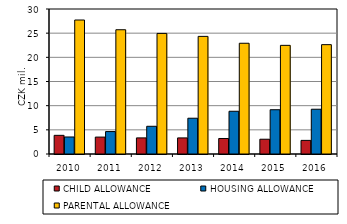
| Category | CHILD ALLOWANCE | HOUSING ALLOWANCE | PARENTAL ALLOWANCE |
|---|---|---|---|
| 2010.0 | 3.862 | 3.521 | 27.722 |
| 2011.0 | 3.498 | 4.641 | 25.709 |
| 2012.0 | 3.332 | 5.732 | 24.95 |
| 2013.0 | 3.329 | 7.403 | 24.336 |
| 2014.0 | 3.207 | 8.843 | 22.913 |
| 2015.0 | 3.057 | 9.161 | 22.48 |
| 2016.0 | 2.817 | 9.262 | 22.625 |